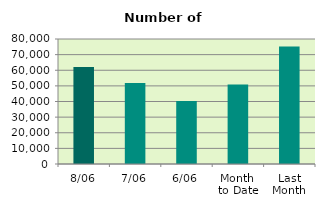
| Category | Series 0 |
|---|---|
| 8/06 | 62094 |
| 7/06 | 51860 |
| 6/06 | 40398 |
| Month 
to Date | 50805.333 |
| Last
Month | 75261.143 |